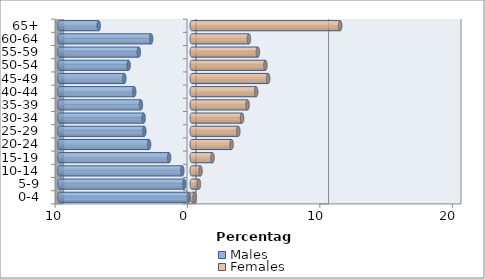
| Category | Males | Females |
|---|---|---|
| 0-4 | -0.212 | 0.209 |
| 5-9 | -0.564 | 0.537 |
| 10-14 | -0.716 | 0.662 |
| 15-19 | -1.712 | 1.566 |
| 20-24 | -3.224 | 3.005 |
| 25-29 | -3.587 | 3.513 |
| 30-34 | -3.637 | 3.795 |
| 35-39 | -3.842 | 4.213 |
| 40-44 | -4.346 | 4.866 |
| 45-49 | -5.092 | 5.768 |
| 50-54 | -4.771 | 5.559 |
| 55-59 | -4 | 4.992 |
| 60-64 | -3.068 | 4.311 |
| 65+ | -7.027 | 11.206 |